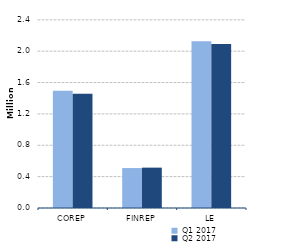
| Category | Q1 2017 | Q2 2017 |
|---|---|---|
| 0 | 1494268 | 1457150 |
| 1/1/00 | 509262 | 514837 |
| 1/2/00 | 2126010 | 2091338 |